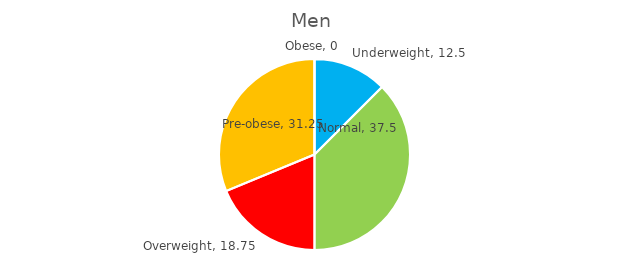
| Category | Men |
|---|---|
| Underweight | 12.5 |
| Normal | 37.5 |
| Overweight | 18.75 |
| Pre-obese | 31.25 |
| Obese | 0 |